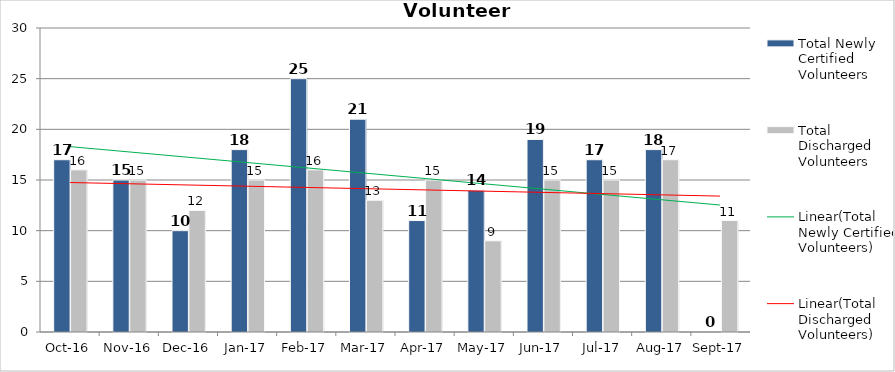
| Category | Total Newly Certified Volunteers | Total Discharged Volunteers |
|---|---|---|
| 2016-10-01 | 17 | 16 |
| 2016-11-01 | 15 | 15 |
| 2016-12-01 | 10 | 12 |
| 2017-01-01 | 18 | 15 |
| 2017-02-01 | 25 | 16 |
| 2017-03-01 | 21 | 13 |
| 2017-04-01 | 11 | 15 |
| 2017-05-01 | 14 | 9 |
| 2017-06-01 | 19 | 15 |
| 2017-07-01 | 17 | 15 |
| 2017-08-01 | 18 | 17 |
| 2017-09-01 | 0 | 11 |